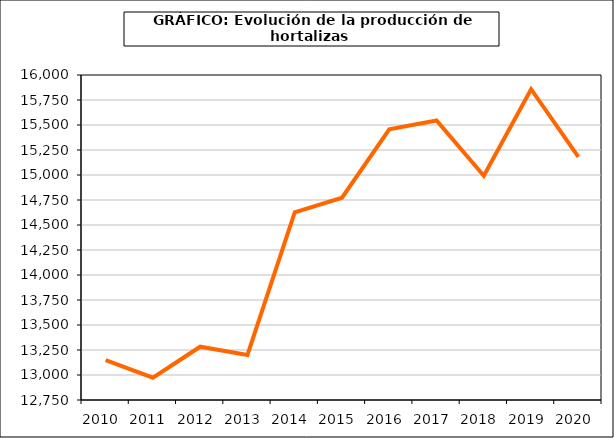
| Category | producción |
|---|---|
| 2010.0 | 13148.152 |
| 2011.0 | 12972.604 |
| 2012.0 | 13282.939 |
| 2013.0 | 13201.085 |
| 2014.0 | 14626.126 |
| 2015.0 | 14772.496 |
| 2016.0 | 15456.102 |
| 2017.0 | 15544.603 |
| 2018.0 | 14992.109 |
| 2019.0 | 15857.731 |
| 2020.0 | 15180.448 |